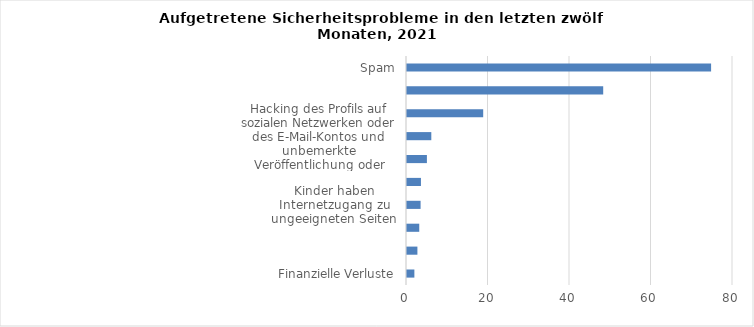
| Category | 2021 |
|---|---|
| Finanzielle Verluste | 1.81 |
| Identitätsdiebstahl | 2.554 |
| Belästigung, Diskriminierung oder Mobbing  | 3.006 |
| Kinder haben Internetzugang zu ungeeigneten Seiten | 3.336 |
| Verlust von Dokumenten wegen einem Virus oder einer anderen Infektion | 3.423 |
| Betrügerische Verwendung der Kredit- oder Debitkarte | 4.884 |
| Hacking des Profils auf sozialen Netzwerken oder des E-Mail-Kontos und unbemerkte Veröffentlichung oder Versand von  Inhalten | 5.965 |
| Umleitung auf gefälschte Internetseiten, wo persönliche Informationen erfragt werden | 18.699 |
| Erhalt von betrügerischen Nachrichten | 48.148 |
| Spam | 74.624 |